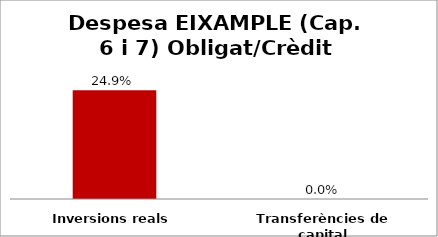
| Category | Series 0 |
|---|---|
| Inversions reals | 0.249 |
| Transferències de capital | 0 |